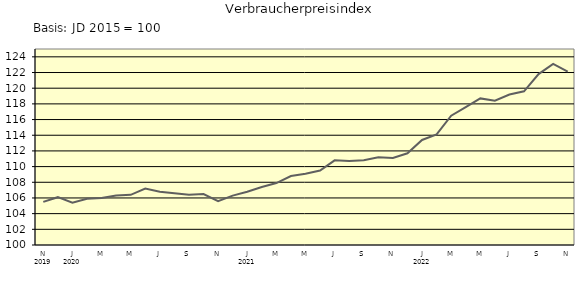
| Category | Series 0 |
|---|---|
| 0 | 105.5 |
| 1 | 106.1 |
| 2 | 105.4 |
| 3 | 105.9 |
| 4 | 106 |
| 5 | 106.3 |
| 6 | 106.4 |
| 7 | 107.2 |
| 8 | 106.8 |
| 9 | 106.6 |
| 10 | 106.4 |
| 11 | 106.5 |
| 12 | 105.6 |
| 13 | 106.3 |
| 14 | 106.8 |
| 15 | 107.4 |
| 16 | 107.9 |
| 17 | 108.8 |
| 18 | 109.1 |
| 19 | 109.5 |
| 20 | 110.8 |
| 21 | 110.7 |
| 22 | 110.8 |
| 23 | 111.2 |
| 24 | 111.1 |
| 25 | 111.7 |
| 26 | 113.4 |
| 27 | 114.1 |
| 28 | 116.5 |
| 29 | 117.6 |
| 30 | 118.7 |
| 31 | 118.4 |
| 32 | 119.2 |
| 33 | 119.6 |
| 34 | 121.8 |
| 35 | 123.1 |
| 36 | 122.1 |